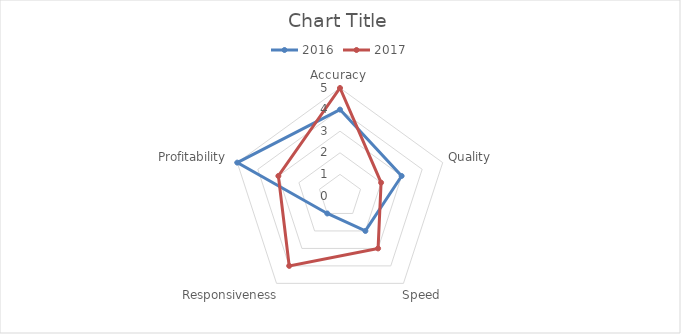
| Category | 2016 | 2017 |
|---|---|---|
| Accuracy | 4 | 5 |
| Quality | 3 | 2 |
| Speed | 2 | 3 |
| Responsiveness | 1 | 4 |
| Profitability | 5 | 3 |